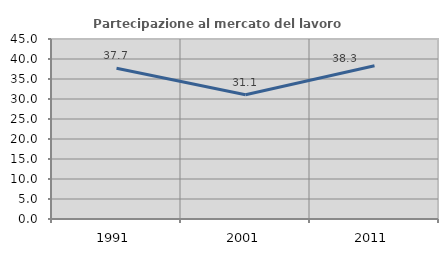
| Category | Partecipazione al mercato del lavoro  femminile |
|---|---|
| 1991.0 | 37.71 |
| 2001.0 | 31.057 |
| 2011.0 | 38.306 |